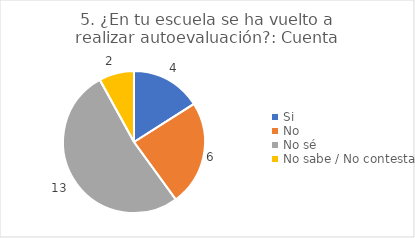
| Category | 5. ¿En tu escuela se ha vuelto a realizar autoevaluación?: |
|---|---|
| Si  | 0.16 |
| No  | 0.24 |
| No sé  | 0.52 |
| No sabe / No contesta | 0.08 |